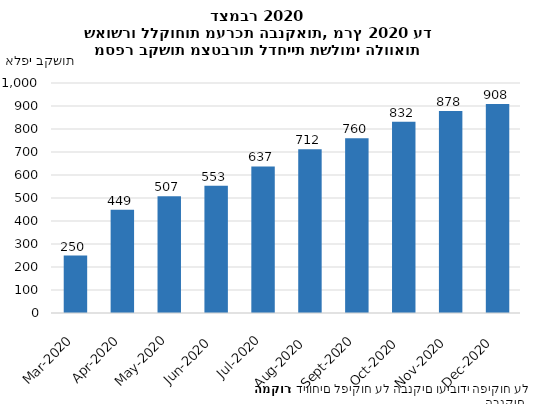
| Category | מס' בקשות דחיית תשלומים שאושרו |
|---|---|
| דצמ-20 | 908.276 |
| נוב-20 | 877.868 |
| אוק-20 | 831.926 |
| ספט-20 | 759.535 |
| אוג-20 | 712.146 |
| יול-20 | 637.051 |
| יונ-20 | 552.946 |
| מאי-20 | 507.173 |
| אפר-20 | 448.676 |
| מרץ-20 | 249.896 |